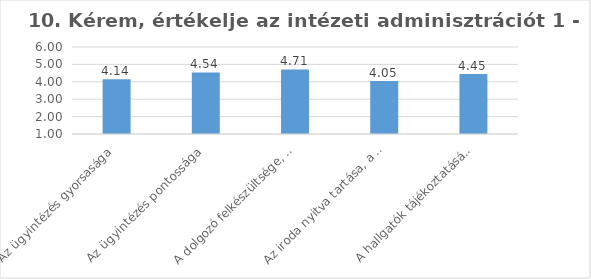
| Category | Series 0 |
|---|---|
| Az ügyintézés gyorsasága | 4.14 |
| Az ügyintézés pontossága | 4.54 |
| A dolgozó felkészültsége, informáltsága | 4.71 |
| Az iroda nyitva tartása, a dolgozó elérhetősége | 4.05 |
| A hallgatók tájékoztatásának minősége | 4.45 |